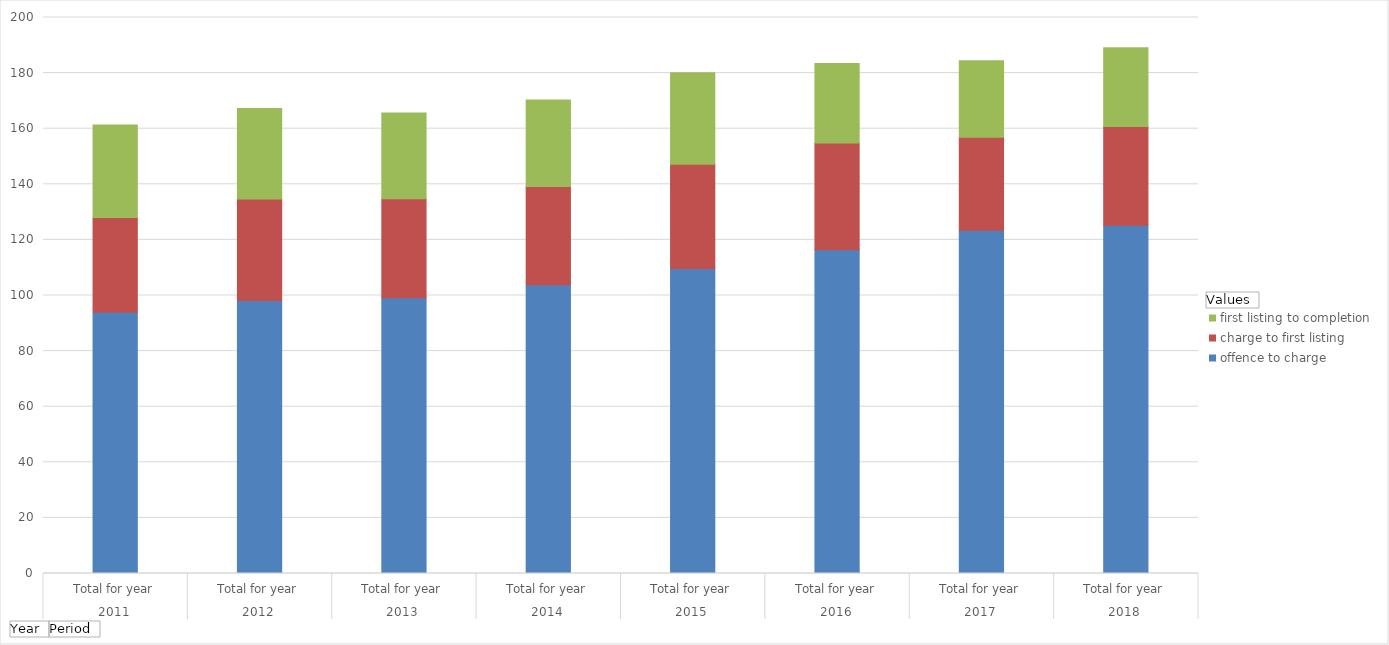
| Category | offence to charge | charge to first listing | first listing to completion |
|---|---|---|---|
| 0 | 93.969 | 34.092 | 33.311 |
| 1 | 98.213 | 36.525 | 32.549 |
| 2 | 99.148 | 35.617 | 30.881 |
| 3 | 103.894 | 35.334 | 31.063 |
| 4 | 109.696 | 37.507 | 32.911 |
| 5 | 116.474 | 38.395 | 28.608 |
| 6 | 123.449 | 33.502 | 27.453 |
| 7 | 125.267 | 35.541 | 28.335 |